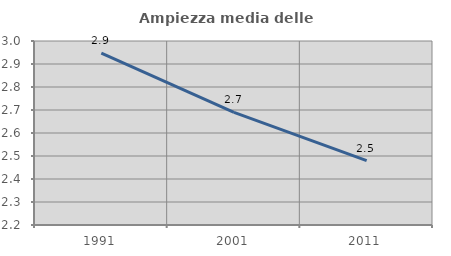
| Category | Ampiezza media delle famiglie |
|---|---|
| 1991.0 | 2.948 |
| 2001.0 | 2.689 |
| 2011.0 | 2.48 |